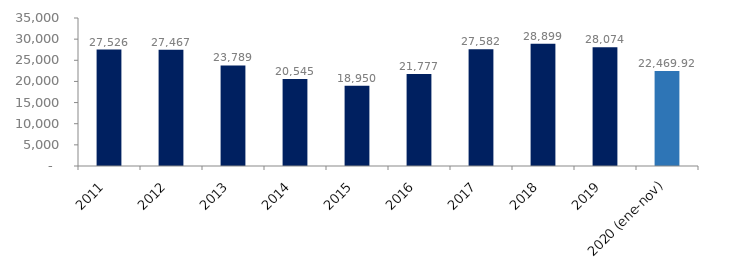
| Category | Series 1 |
|---|---|
| 2011 | 27525.675 |
| 2012 | 27466.673 |
| 2013 | 23789.445 |
| 2014 | 20545.414 |
| 2015 | 18950.14 |
| 2016 | 21776.636 |
| 2017 | 27581.607 |
| 2018 | 28898.658 |
| 2019 | 28073.793 |
| 2020 (ene-nov) | 22469.924 |